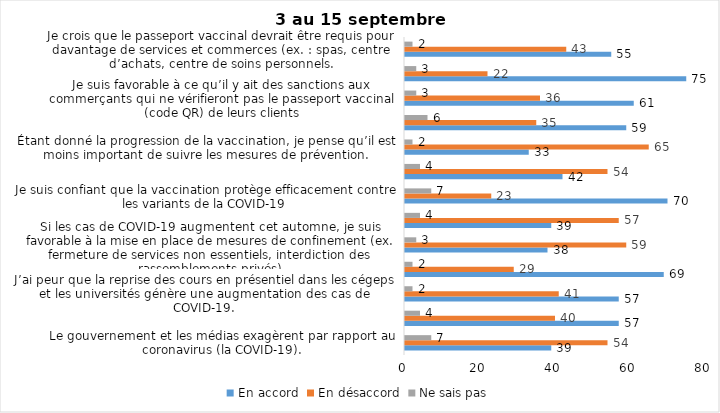
| Category | En accord | En désaccord | Ne sais pas |
|---|---|---|---|
| Le gouvernement et les médias exagèrent par rapport au coronavirus (la COVID-19). | 39 | 54 | 7 |
| J’ai peur que le système de santé soit débordé par les cas de COVID-19 suite au "déconfinement" | 57 | 40 | 4 |
| J’ai peur que la reprise des cours en présentiel dans les cégeps et les universités génère une augmentation des cas de COVID-19. | 57 | 41 | 2 |
| Je suis favorable au passeport vaccinal qui permettrait l'accès à certains lieux ou activités aux personnes vaccinées. | 69 | 29 | 2 |
| Si les cas de COVID-19 augmentent cet automne, je suis favorable à la mise en place de mesures de confinement (ex. fermeture de services non essentiels, interdiction des rassemblements privés) | 38 | 59 | 3 |
| Je suis inquiet de contracter le variant Delta de la Covid-19 | 39 | 57 | 4 |
| Je suis confiant que la vaccination protège efficacement contre les variants de la COVID-19 | 70 | 23 | 7 |
| Je suis favorable à ce que le port du masque ne soit plus obligatoire au Québec. | 42 | 54 | 4 |
| Étant donné la progression de la vaccination, je pense qu’il est moins important de suivre les mesures de prévention. | 33 | 65 | 2 |
| J'ai peur que la reprise des cours en présentiel dans les écoles primaires et secondaires génère une augmentation des cas de COVID-19 | 59 | 35 | 6 |
| Je suis favorable à ce qu’il y ait des sanctions aux commerçants qui ne vérifieront pas le passeport vaccinal (code QR) de leurs clients | 61 | 36 | 3 |
| Je suis favorable à ce qu’il y ait des sanctions aux gens qui tenteront de frauder leur passeport vaccinal par des amendes ou des accusations criminelles. | 75 | 22 | 3 |
| Je crois que le passeport vaccinal devrait être requis pour davantage de services et commerces (ex. : spas, centre d’achats, centre de soins personnels. | 55 | 43 | 2 |